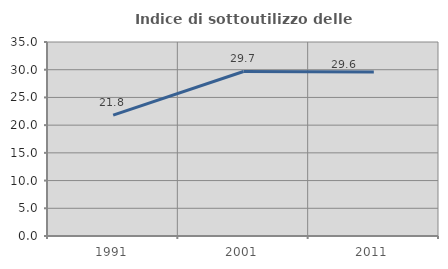
| Category | Indice di sottoutilizzo delle abitazioni  |
|---|---|
| 1991.0 | 21.799 |
| 2001.0 | 29.681 |
| 2011.0 | 29.607 |